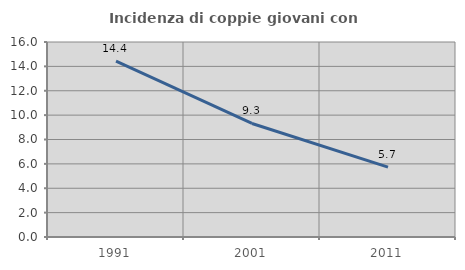
| Category | Incidenza di coppie giovani con figli |
|---|---|
| 1991.0 | 14.428 |
| 2001.0 | 9.316 |
| 2011.0 | 5.734 |